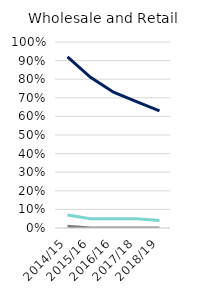
| Category | Employed | Self-Employed | Both |
|---|---|---|---|
| 2014/15 | 0.92 | 0.07 | 0.01 |
| 2015/16 | 0.81 | 0.05 | 0 |
| 2016/16 | 0.73 | 0.05 | 0 |
| 2017/18 | 0.68 | 0.05 | 0 |
| 2018/19 | 0.63 | 0.04 | 0 |